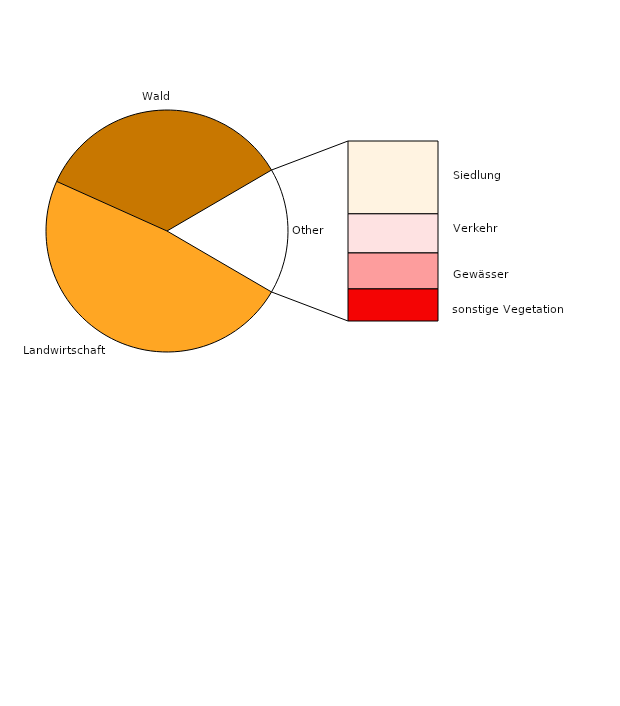
| Category | Series 0 |
|---|---|
| Landwirtschaft | 1432847 |
| Wald | 1034252 |
| Siedlung | 201596 |
| Verkehr | 108365 |
| Gewässer | 99575 |
| sonstige Vegetation | 88801 |